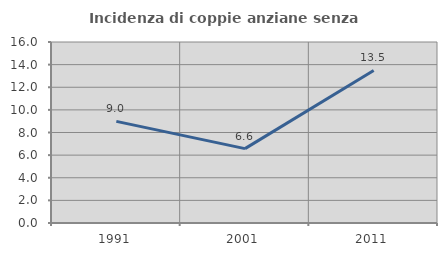
| Category | Incidenza di coppie anziane senza figli  |
|---|---|
| 1991.0 | 8.983 |
| 2001.0 | 6.576 |
| 2011.0 | 13.488 |